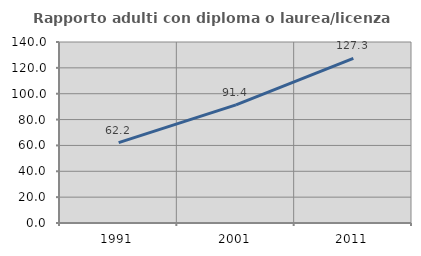
| Category | Rapporto adulti con diploma o laurea/licenza media  |
|---|---|
| 1991.0 | 62.158 |
| 2001.0 | 91.4 |
| 2011.0 | 127.313 |